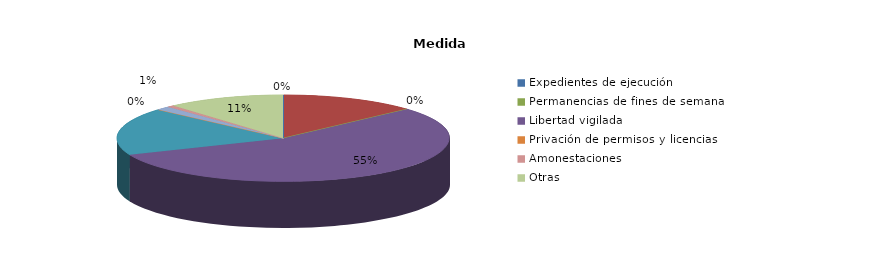
| Category | Series 0 |
|---|---|
| Expedientes de ejecución | 0 |
| Internamientos | 59 |
| Permanencias de fines de semana | 0 |
| Libertad vigilada | 246 |
| Prestaciones en beneficio de la comunidad | 79 |
| Privación de permisos y licencias | 0 |
| Convivencia Familiar Educativa | 6 |
| Amonestaciones | 3 |
| Otras | 51 |